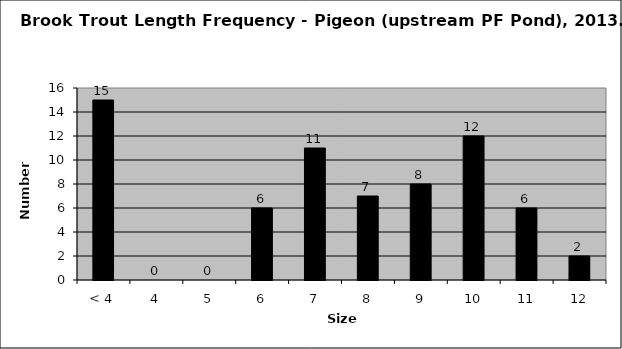
| Category | Series 0 |
|---|---|
| < 4 | 15 |
| 4 | 0 |
| 5 | 0 |
| 6 | 6 |
| 7 | 11 |
| 8 | 7 |
| 9 | 8 |
| 10 | 12 |
| 11 | 6 |
| 12 | 2 |